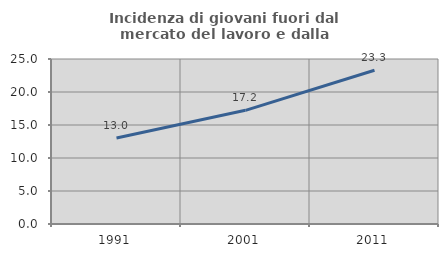
| Category | Incidenza di giovani fuori dal mercato del lavoro e dalla formazione  |
|---|---|
| 1991.0 | 13.027 |
| 2001.0 | 17.222 |
| 2011.0 | 23.288 |